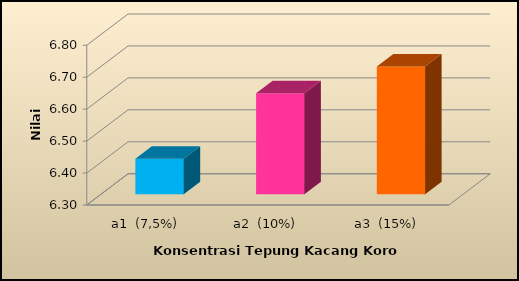
| Category | Rata-rata |
|---|---|
| a1  (7,5%) | 6.411 |
| a2  (10%) | 6.616 |
| a3  (15%) | 6.7 |